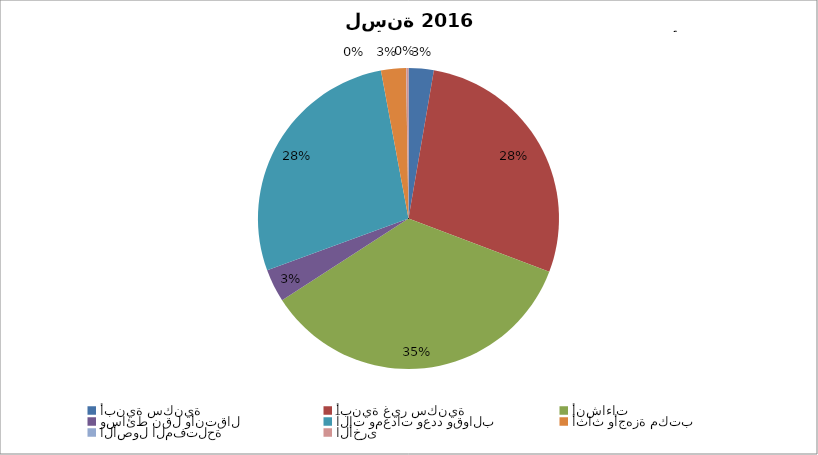
| Category | Series 0 |
|---|---|
| أبنية سكنية | 5011744.882 |
| أبنية غير سكنية | 52029824.858 |
| أنشاءات | 65096882.553 |
| وسائط نقل وأنتقال | 6572345.404 |
| آلات ومعدات وعدد وقوالب | 51261623.552 |
| أثاث وأجهزة مكتب | 4958628.181 |
| الأصول المفتلحة | 55527.305 |
| الأخرى  | 427693.413 |